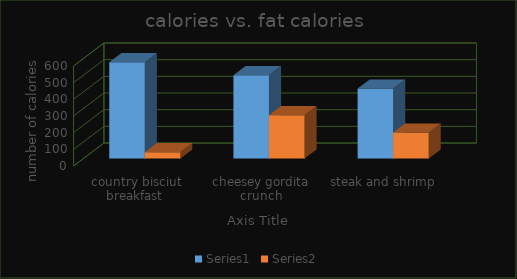
| Category | Series 0 | Series 1 |
|---|---|---|
| country bisciut breakfast  | 578 | 38 |
| cheesey gordita crunch | 500 | 260 |
| steak and shrimp | 420 | 156 |